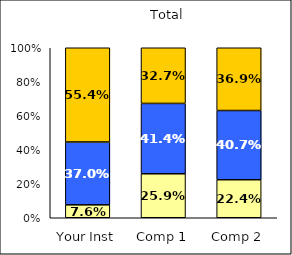
| Category | Low Sense of Belonging | Average Sense of Belonging | High Sense of Belonging |
|---|---|---|---|
| Your Inst | 0.076 | 0.37 | 0.554 |
| Comp 1 | 0.259 | 0.414 | 0.327 |
| Comp 2 | 0.224 | 0.407 | 0.369 |